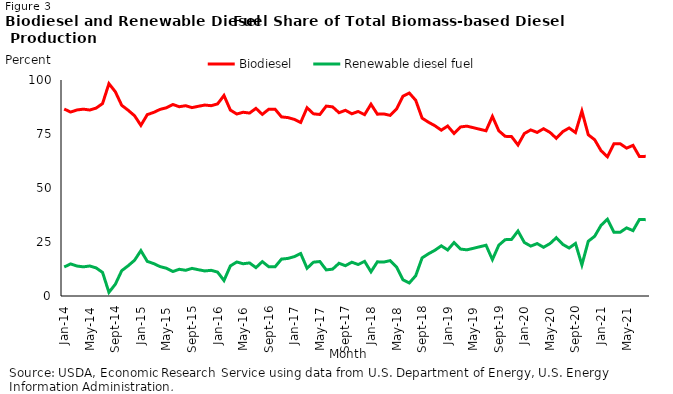
| Category | Biodiesel | Renewable diesel fuel |
|---|---|---|
| 2014-01-01 | 86.566 | 13.434 |
| 2014-02-01 | 85.159 | 14.841 |
| 2014-03-01 | 86.138 | 13.862 |
| 2014-04-01 | 86.501 | 13.499 |
| 2014-05-01 | 86.105 | 13.895 |
| 2014-06-01 | 87.002 | 12.998 |
| 2014-07-01 | 89.081 | 10.919 |
| 2014-08-01 | 98.307 | 1.693 |
| 2014-09-01 | 94.564 | 5.436 |
| 2014-10-01 | 88.284 | 11.716 |
| 2014-11-01 | 86.013 | 13.987 |
| 2014-12-01 | 83.474 | 16.526 |
| 2015-01-01 | 79.007 | 20.993 |
| 2015-02-01 | 83.979 | 16.021 |
| 2015-03-01 | 84.991 | 15.009 |
| 2015-04-01 | 86.398 | 13.602 |
| 2015-05-01 | 87.146 | 12.854 |
| 2015-06-01 | 88.671 | 11.329 |
| 2015-07-01 | 87.63 | 12.37 |
| 2015-08-01 | 88.097 | 11.903 |
| 2015-09-01 | 87.216 | 12.784 |
| 2015-10-01 | 87.835 | 12.165 |
| 2015-11-01 | 88.396 | 11.604 |
| 2015-12-01 | 88.111 | 11.889 |
| 2016-01-01 | 88.93 | 11.07 |
| 2016-02-01 | 92.834 | 7.166 |
| 2016-03-01 | 86.074 | 13.926 |
| 2016-04-01 | 84.253 | 15.747 |
| 2016-05-01 | 85.066 | 14.934 |
| 2016-06-01 | 84.691 | 15.309 |
| 2016-07-01 | 86.859 | 13.141 |
| 2016-08-01 | 84.08 | 15.92 |
| 2016-09-01 | 86.445 | 13.555 |
| 2016-10-01 | 86.475 | 13.525 |
| 2016-11-01 | 82.914 | 17.086 |
| 2016-12-01 | 82.606 | 17.394 |
| 2017-01-01 | 81.773 | 18.227 |
| 2017-02-01 | 80.338 | 19.662 |
| 2017-03-01 | 87.153 | 12.847 |
| 2017-04-01 | 84.351 | 15.649 |
| 2017-05-01 | 84.029 | 15.971 |
| 2017-06-01 | 87.918 | 12.082 |
| 2017-07-01 | 87.557 | 12.443 |
| 2017-08-01 | 84.852 | 15.148 |
| 2017-09-01 | 85.974 | 14.026 |
| 2017-10-01 | 84.357 | 15.643 |
| 2017-11-01 | 85.429 | 14.571 |
| 2017-12-01 | 83.947 | 16.053 |
| 2018-01-01 | 88.796 | 11.204 |
| 2018-02-01 | 84.184 | 15.816 |
| 2018-03-01 | 84.288 | 15.712 |
| 2018-04-01 | 83.624 | 16.376 |
| 2018-05-01 | 86.539 | 13.461 |
| 2018-06-01 | 92.512 | 7.488 |
| 2018-07-01 | 93.957 | 6.043 |
| 2018-08-01 | 90.599 | 9.401 |
| 2018-09-01 | 82.352 | 17.648 |
| 2018-10-01 | 80.448 | 19.552 |
| 2018-11-01 | 78.829 | 21.171 |
| 2018-12-01 | 76.773 | 23.227 |
| 2019-01-01 | 78.687 | 21.313 |
| 2019-02-01 | 75.242 | 24.758 |
| 2019-03-01 | 78.261 | 21.739 |
| 2019-04-01 | 78.635 | 21.365 |
| 2019-05-01 | 77.933 | 22.067 |
| 2019-06-01 | 77.209 | 22.791 |
| 2019-07-01 | 76.499 | 23.501 |
| 2019-08-01 | 83.136 | 16.864 |
| 2019-09-01 | 76.486 | 23.514 |
| 2019-10-01 | 73.919 | 26.081 |
| 2019-11-01 | 73.791 | 26.209 |
| 2019-12-01 | 69.916 | 30.084 |
| 2020-01-01 | 75.235 | 24.765 |
| 2020-02-01 | 76.896 | 23.104 |
| 2020-03-01 | 75.727 | 24.273 |
| 2020-04-01 | 77.449 | 22.551 |
| 2020-05-01 | 75.76 | 24.24 |
| 2020-06-01 | 73.012 | 26.988 |
| 2020-07-01 | 76.087 | 23.913 |
| 2020-08-01 | 77.789 | 22.211 |
| 2020-09-01 | 75.669 | 24.331 |
| 2020-10-01 | 85.603 | 14.397 |
| 2020-11-01 | 74.644 | 25.356 |
| 2020-12-01 | 72.341 | 27.659 |
| 2021-01-01 | 67.264 | 32.736 |
| 2021-02-01 | 64.435 | 35.565 |
| 2021-03-01 | 70.439 | 29.561 |
| 2021-04-01 | 70.467 | 29.533 |
| 2021-05-01 | 68.456 | 31.544 |
| 2021-06-01 | 69.74 | 30.26 |
| 2021-07-01 | 64.568 | 35.432 |
| 2021-08-01 | 64.653 | 35.347 |